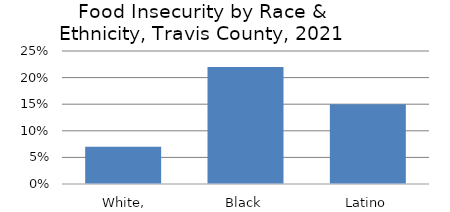
| Category | Series 0 |
|---|---|
| White, Non-Hispanic | 0.07 |
| Black | 0.22 |
| Latino | 0.15 |